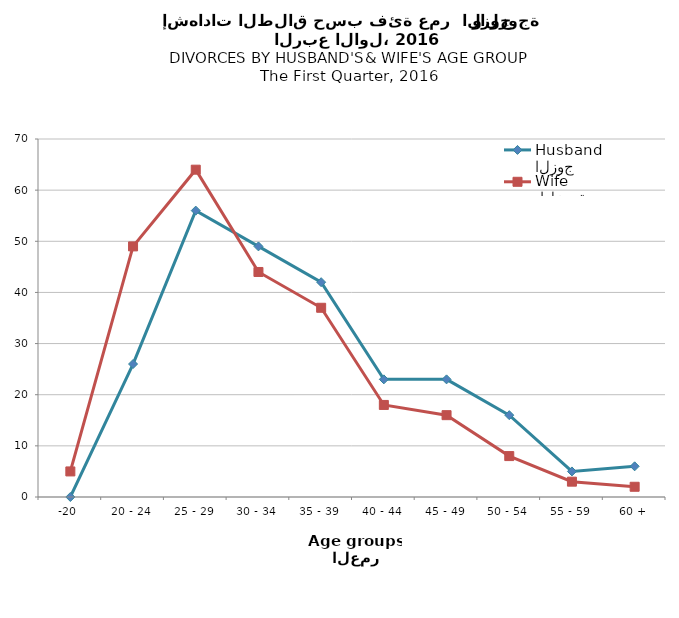
| Category | الزوج
Husband |  الزوجة
Wife |
|---|---|---|
| -20 | 0 | 5 |
| 20 - 24 | 26 | 49 |
| 25 - 29 | 56 | 64 |
| 30 - 34 | 49 | 44 |
| 35 - 39 | 42 | 37 |
| 40 - 44 | 23 | 18 |
| 45 - 49 | 23 | 16 |
| 50 - 54 | 16 | 8 |
| 55 - 59 | 5 | 3 |
| 60 + | 6 | 2 |